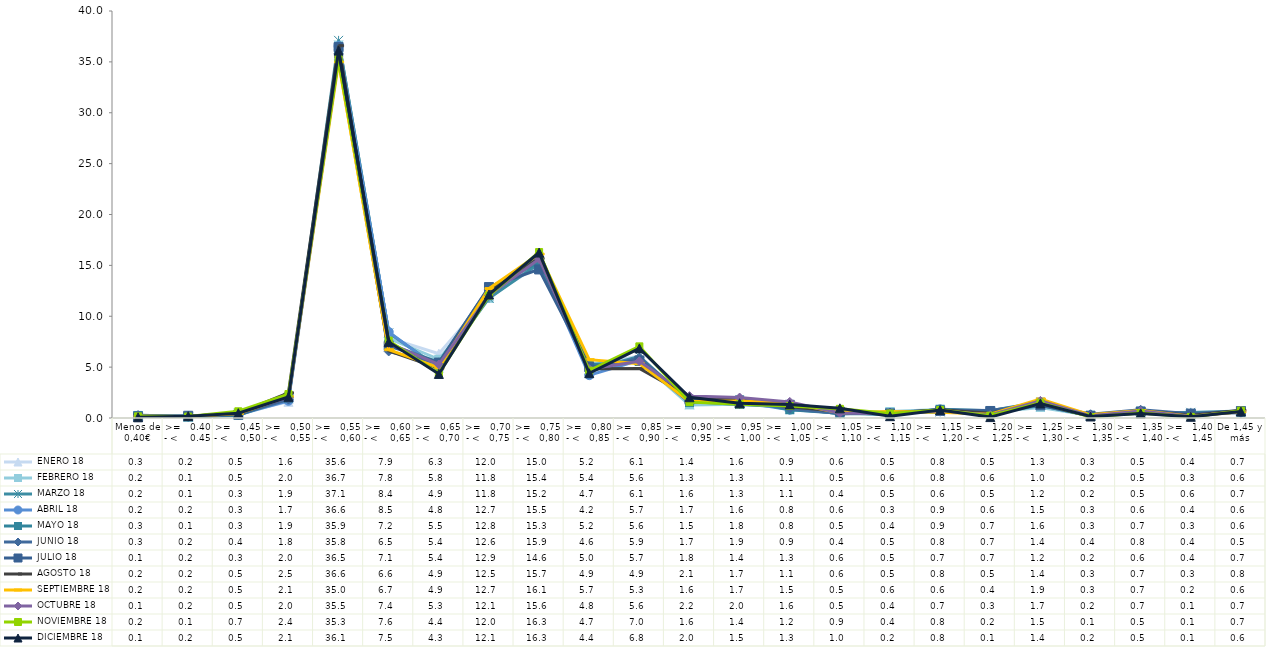
| Category |  ENERO 18 |  FEBRERO 18 |  MARZO 18 |  ABRIL 18 |  MAYO 18 |  JUNIO 18 |  JULIO 18 |  AGOSTO 18 |  SEPTIEMBRE 18 |  OCTUBRE 18 |  NOVIEMBRE 18 |  DICIEMBRE 18 |
|---|---|---|---|---|---|---|---|---|---|---|---|---|
| Menos de 0,40€ | 0.27 | 0.23 | 0.24 | 0.2 | 0.25 | 0.28 | 0.12 | 0.15 | 0.17 | 0.08 | 0.16 | 0.07 |
| >=   0.40 - <    0.45 | 0.17 | 0.08 | 0.1 | 0.16 | 0.11 | 0.17 | 0.22 | 0.15 | 0.15 | 0.15 | 0.14 | 0.18 |
| >=   0,45 - <    0,50 | 0.47 | 0.47 | 0.33 | 0.32 | 0.28 | 0.4 | 0.33 | 0.47 | 0.45 | 0.53 | 0.66 | 0.47 |
| >=   0,50 - <    0,55 | 1.59 | 1.95 | 1.9 | 1.69 | 1.94 | 1.81 | 2.02 | 2.48 | 2.09 | 2.02 | 2.35 | 2.08 |
| >=   0,55 - <    0,60 | 35.62 | 36.65 | 37.11 | 36.55 | 35.9 | 35.81 | 36.45 | 36.59 | 34.99 | 35.48 | 35.27 | 36.11 |
| >=   0,60 - <    0,65 | 7.87 | 7.82 | 8.37 | 8.46 | 7.24 | 6.54 | 7.09 | 6.6 | 6.71 | 7.36 | 7.6 | 7.48 |
| >=   0,65 - <   0,70 | 6.32 | 5.77 | 4.94 | 4.82 | 5.48 | 5.37 | 5.43 | 4.89 | 4.94 | 5.26 | 4.37 | 4.33 |
| >=   0,70 - <   0,75 | 12 | 11.76 | 11.77 | 12.66 | 12.8 | 12.63 | 12.87 | 12.53 | 12.72 | 12.06 | 12.03 | 12.14 |
| >=   0,75 - <   0,80 | 14.99 | 15.39 | 15.19 | 15.48 | 15.29 | 15.89 | 14.6 | 15.68 | 16.11 | 15.63 | 16.31 | 16.26 |
| >=   0,80 - <   0,85 | 5.21 | 5.36 | 4.73 | 4.21 | 5.24 | 4.61 | 5.02 | 4.85 | 5.73 | 4.81 | 4.65 | 4.4 |
| >=   0,85 - <   0,90 | 6.08 | 5.62 | 6.06 | 5.68 | 5.56 | 5.93 | 5.66 | 4.87 | 5.34 | 5.57 | 7.04 | 6.84 |
| >=   0,90 - <    0,95 | 1.37 | 1.29 | 1.62 | 1.67 | 1.52 | 1.71 | 1.79 | 2.1 | 1.62 | 2.15 | 1.56 | 2.04 |
| >=   0,95 - <   1,00 | 1.56 | 1.34 | 1.33 | 1.6 | 1.79 | 1.92 | 1.43 | 1.74 | 1.68 | 2.01 | 1.35 | 1.45 |
| >=   1,00 - <   1,05 | 0.9 | 1.06 | 1.09 | 0.82 | 0.81 | 0.91 | 1.3 | 1.1 | 1.47 | 1.58 | 1.18 | 1.33 |
| >=   1,05 - <    1,10 | 0.57 | 0.46 | 0.4 | 0.55 | 0.46 | 0.44 | 0.63 | 0.64 | 0.52 | 0.5 | 0.9 | 0.95 |
| >=   1,10 - <   1,15 | 0.51 | 0.64 | 0.52 | 0.34 | 0.35 | 0.54 | 0.45 | 0.48 | 0.64 | 0.42 | 0.44 | 0.18 |
| >=   1,15 - <    1,20 | 0.8 | 0.83 | 0.6 | 0.85 | 0.86 | 0.78 | 0.7 | 0.82 | 0.57 | 0.71 | 0.79 | 0.78 |
| >=   1,20 - <    1,25 | 0.52 | 0.57 | 0.45 | 0.55 | 0.71 | 0.73 | 0.69 | 0.46 | 0.38 | 0.3 | 0.23 | 0.09 |
| >=   1,25 - <    1,30 | 1.3 | 1.04 | 1.23 | 1.47 | 1.56 | 1.42 | 1.24 | 1.43 | 1.87 | 1.68 | 1.5 | 1.43 |
| >=   1,30 - <    1,35 | 0.3 | 0.24 | 0.21 | 0.26 | 0.28 | 0.37 | 0.2 | 0.28 | 0.31 | 0.21 | 0.1 | 0.15 |
| >=   1,35 - <    1,40 | 0.51 | 0.51 | 0.54 | 0.64 | 0.67 | 0.81 | 0.63 | 0.68 | 0.73 | 0.68 | 0.5 | 0.45 |
| >=   1,40 - <    1,45 | 0.37 | 0.32 | 0.55 | 0.42 | 0.31 | 0.42 | 0.43 | 0.25 | 0.18 | 0.14 | 0.11 | 0.12 |
| De 1,45 y más | 0.68 | 0.59 | 0.7 | 0.59 | 0.59 | 0.51 | 0.68 | 0.76 | 0.61 | 0.67 | 0.72 | 0.63 |